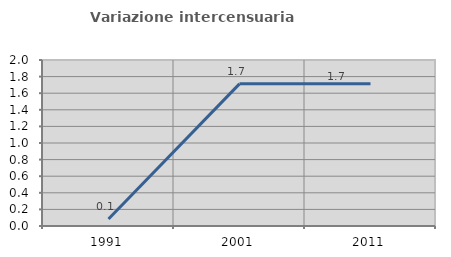
| Category | Variazione intercensuaria annua |
|---|---|
| 1991.0 | 0.084 |
| 2001.0 | 1.713 |
| 2011.0 | 1.715 |